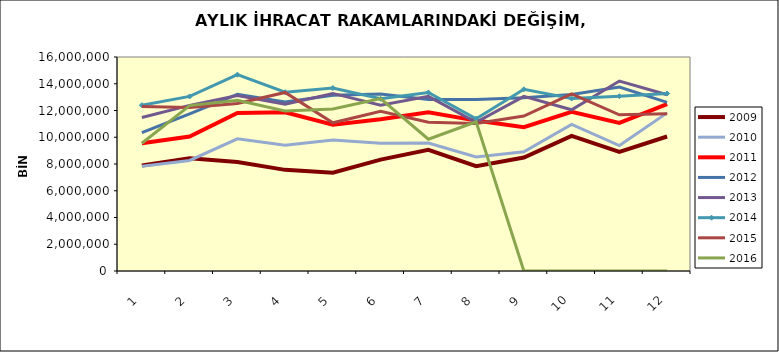
| Category | 2009 | 2010 | 2011 | 2012 | 2013 | 2014 | 2015 | 2016 |
|---|---|---|---|---|---|---|---|---|
| 0 | 7884493.524 | 7828748.058 | 9551084.639 | 10348187.166 | 11481521.079 | 12399761.948 | 12301766.75 | 9548480.687 |
| 1 | 8435115.834 | 8263237.814 | 10059126.307 | 11748000.124 | 12385690.909 | 13053292.493 | 12231860.14 | 12368484.651 |
| 2 | 8155485.081 | 9886488.171 | 11811085.16 | 13208572.977 | 13122058.141 | 14680110.78 | 12519910.438 | 12760741.637 |
| 3 | 7561696.283 | 9396006.654 | 11873269.447 | 12630226.718 | 12468202.903 | 13371185.664 | 13349346.866 | 11957227.112 |
| 4 | 7346407.528 | 9799958.117 | 10943364.372 | 13131530.961 | 13277209.017 | 13681906.159 | 11080385.127 | 12110893.315 |
| 5 | 8329692.783 | 9542907.644 | 11349953.558 | 13231198.688 | 12399973.962 | 12880924.246 | 11949647.086 | 12893841.158 |
| 6 | 9055733.671 | 9564682.545 | 11860004.271 | 12830675.307 | 13059519.685 | 13344776.958 | 11129358.974 | 9855005.219 |
| 7 | 7839908.842 | 8523451.973 | 11245124.657 | 12831394.572 | 11118300.903 | 11386828.925 | 11022045.344 | 11157251.497 |
| 8 | 8480708.387 | 8909230.521 | 10750626.099 | 12952651.722 | 13060371.039 | 13583120.906 | 11581703.842 | 0 |
| 9 | 10095768.03 | 10963586.27 | 11907219.297 | 13190769.655 | 12053704.638 | 12891630.102 | 13240039.088 | 0 |
| 10 | 8903010.773 | 9382369.718 | 11078524.743 | 13753052.493 | 14201227.351 | 13067348.107 | 11681989.013 | 0 |
| 11 | 10054591.867 | 11822551.699 | 12477486.28 | 12605476.173 | 13174857.46 | 13269271.402 | 11750818.76 | 0 |